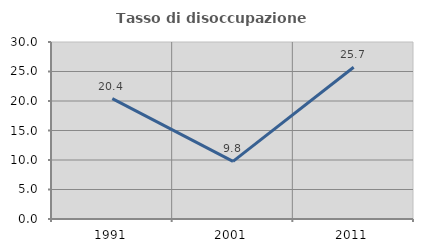
| Category | Tasso di disoccupazione giovanile  |
|---|---|
| 1991.0 | 20.408 |
| 2001.0 | 9.756 |
| 2011.0 | 25.714 |